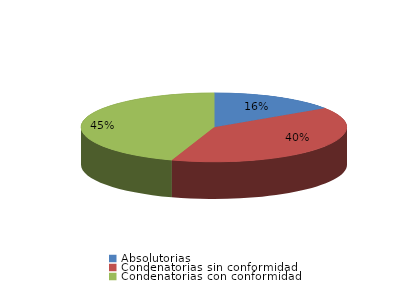
| Category | Series 0 |
|---|---|
| Absolutorias | 32 |
| Condenatorias sin conformidad | 81 |
| Condenatorias con conformidad | 92 |